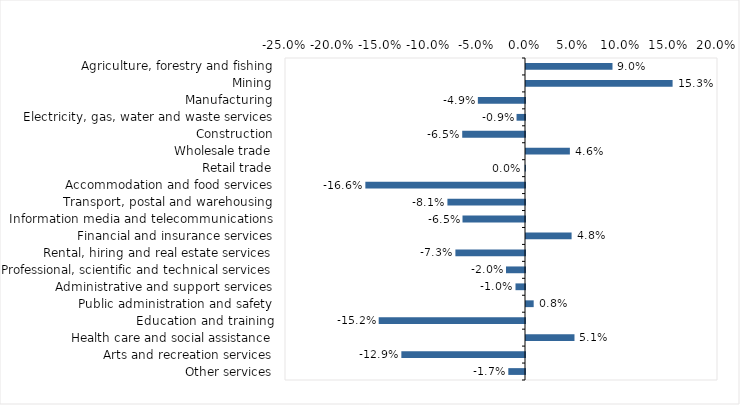
| Category | This week |
|---|---|
| Agriculture, forestry and fishing | 0.09 |
| Mining | 0.153 |
| Manufacturing | -0.049 |
| Electricity, gas, water and waste services | -0.009 |
| Construction | -0.065 |
| Wholesale trade | 0.046 |
| Retail trade | 0 |
| Accommodation and food services | -0.166 |
| Transport, postal and warehousing | -0.081 |
| Information media and telecommunications | -0.065 |
| Financial and insurance services | 0.048 |
| Rental, hiring and real estate services | -0.072 |
| Professional, scientific and technical services | -0.02 |
| Administrative and support services | -0.01 |
| Public administration and safety | 0.008 |
| Education and training | -0.152 |
| Health care and social assistance | 0.05 |
| Arts and recreation services | -0.129 |
| Other services | -0.017 |